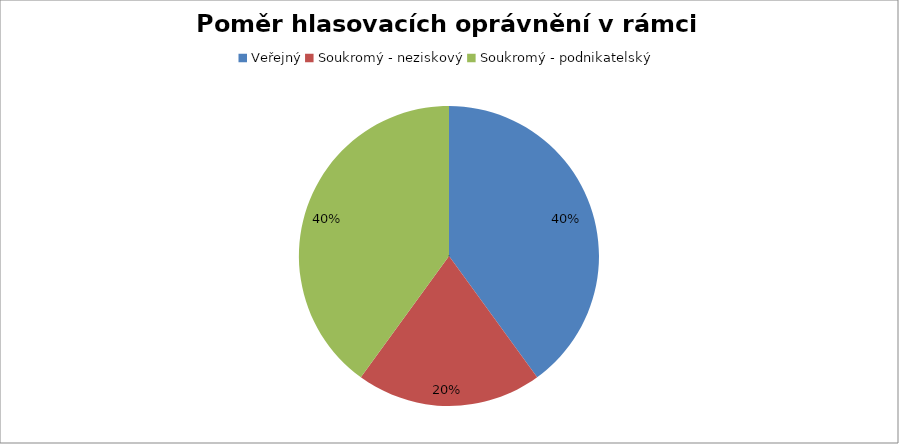
| Category | Series 0 |
|---|---|
| Veřejný | 0.4 |
| Soukromý - neziskový | 0.2 |
| Soukromý - podnikatelský | 0.4 |